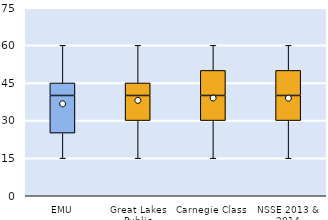
| Category | 25th | 50th | 75th |
|---|---|---|---|
| EMU | 25 | 15 | 5 |
| Great Lakes Public | 30 | 10 | 5 |
| Carnegie Class | 30 | 10 | 10 |
| NSSE 2013 & 2014 | 30 | 10 | 10 |